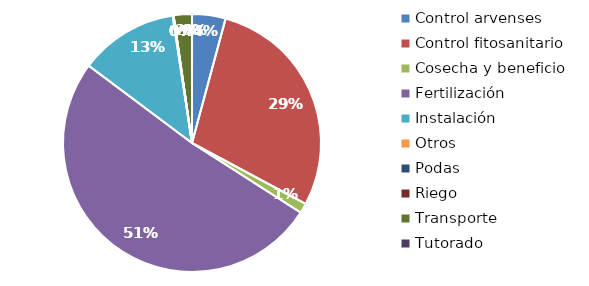
| Category | Valor |
|---|---|
| Control arvenses | 110000 |
| Control fitosanitario | 750000 |
| Cosecha y beneficio | 32000 |
| Fertilización | 1340000 |
| Instalación | 324000 |
| Otros | 3000 |
| Podas | 0 |
| Riego | 0 |
| Transporte | 60000 |
| Tutorado | 0 |